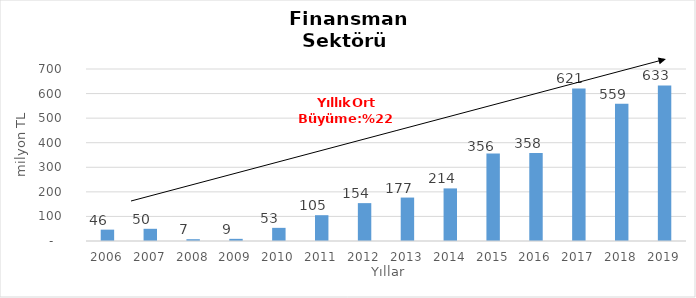
| Category | Finansman |
|---|---|
| 2006.0 | 46.209 |
| 2007.0 | 49.659 |
| 2008.0 | 7.339 |
| 2009.0 | 8.77 |
| 2010.0 | 53.492 |
| 2011.0 | 105.032 |
| 2012.0 | 154.13 |
| 2013.0 | 176.798 |
| 2014.0 | 214.053 |
| 2015.0 | 356 |
| 2016.0 | 358 |
| 2017.0 | 621 |
| 2018.0 | 559 |
| 2019.0 | 633 |